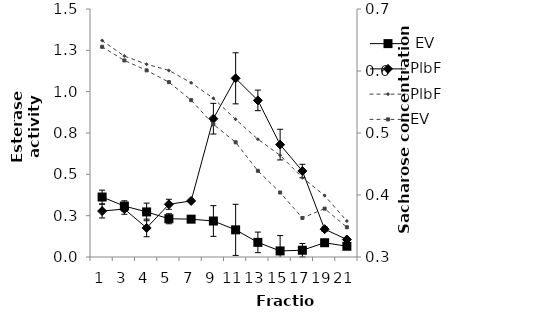
| Category |  EV | PlbF |
|---|---|---|
| 1.0 | 0.363 | 0.278 |
| 3.0 | 0.308 | 0.29 |
| 4.0 | 0.273 | 0.176 |
| 5.0 | 0.231 | 0.319 |
| 7.0 | 0.229 | 0.339 |
| 9.0 | 0.218 | 0.837 |
| 11.0 | 0.164 | 1.081 |
| 13.0 | 0.088 | 0.947 |
| 15.0 | 0.037 | 0.68 |
| 17.0 | 0.041 | 0.52 |
| 19.0 | 0.086 | 0.168 |
| 21.0 | 0.065 | 0.106 |